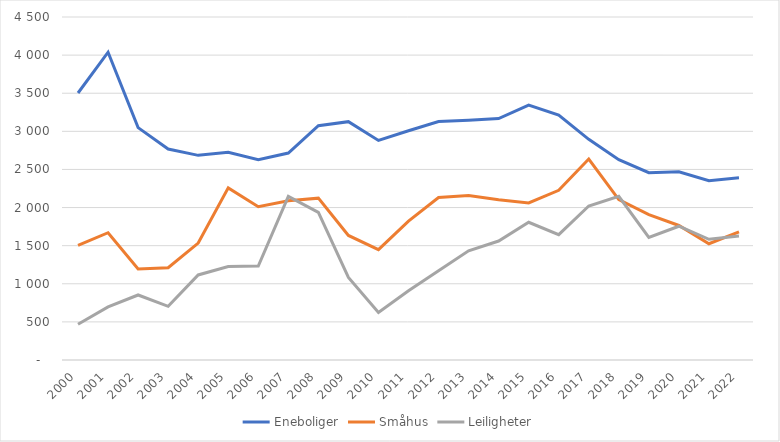
| Category | Eneboliger | Småhus | Leiligheter |
|---|---|---|---|
| 2000.0 | 3503 | 1503 | 470 |
| 2001.0 | 4038 | 1670 | 697 |
| 2002.0 | 3049 | 1194 | 853 |
| 2003.0 | 2768 | 1210 | 704 |
| 2004.0 | 2685 | 1534 | 1116 |
| 2005.0 | 2725 | 2258 | 1227 |
| 2006.0 | 2628 | 2011 | 1233 |
| 2007.0 | 2715 | 2090 | 2147 |
| 2008.0 | 3074 | 2123 | 1936 |
| 2009.0 | 3127 | 1634 | 1084 |
| 2010.0 | 2881 | 1448 | 623 |
| 2011.0 | 3007 | 1822 | 908 |
| 2012.0 | 3128 | 2131 | 1172 |
| 2013.0 | 3147 | 2159 | 1433 |
| 2014.0 | 3168 | 2101 | 1561 |
| 2015.0 | 3344 | 2061 | 1807 |
| 2016.0 | 3214 | 2226 | 1644 |
| 2017.0 | 2895 | 2637 | 2020 |
| 2018.0 | 2628 | 2105 | 2147 |
| 2019.0 | 2458 | 1907 | 1609 |
| 2020.0 | 2470 | 1765 | 1755 |
| 2021.0 | 2353 | 1525 | 1584 |
| 2022.0 | 2390 | 1680 | 1626 |